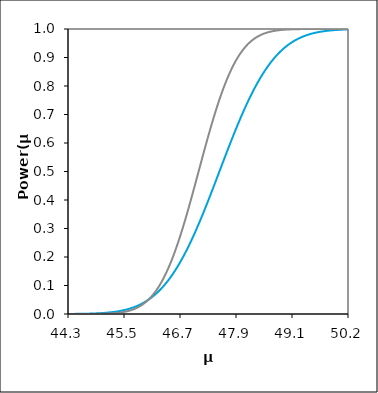
| Category | blue | red |
|---|---|---|
| 44.32138721247417 | 0 | 0 |
| 44.33322166362427 | 0 | 0 |
| 44.34505611477437 | 0 | 0 |
| 44.35689056592447 | 0 | 0 |
| 44.36872501707457 | 0 | 0 |
| 44.38055946822467 | 0 | 0 |
| 44.39239391937477 | 0 | 0 |
| 44.40422837052487 | 0 | 0 |
| 44.41606282167498 | 0 | 0 |
| 44.42789727282508 | 0 | 0 |
| 44.43973172397517 | 0 | 0 |
| 44.45156617512528 | 0 | 0 |
| 44.46340062627538 | 0 | 0 |
| 44.47523507742548 | 0 | 0 |
| 44.48706952857558 | 0 | 0 |
| 44.49890397972568 | 0.001 | 0 |
| 44.51073843087578 | 0.001 | 0 |
| 44.52257288202588 | 0.001 | 0 |
| 44.53440733317598 | 0.001 | 0 |
| 44.54624178432609 | 0.001 | 0 |
| 44.55807623547619 | 0.001 | 0 |
| 44.56991068662629 | 0.001 | 0 |
| 44.58174513777639 | 0.001 | 0 |
| 44.59357958892649 | 0.001 | 0 |
| 44.60541404007659 | 0.001 | 0 |
| 44.61724849122669 | 0.001 | 0 |
| 44.6290829423768 | 0.001 | 0 |
| 44.6409173935269 | 0.001 | 0 |
| 44.652751844677 | 0.001 | 0 |
| 44.6645862958271 | 0.001 | 0 |
| 44.6764207469772 | 0.001 | 0 |
| 44.6882551981273 | 0.001 | 0 |
| 44.70008964927739 | 0.001 | 0 |
| 44.7119241004275 | 0.001 | 0 |
| 44.7237585515776 | 0.001 | 0 |
| 44.7355930027277 | 0.001 | 0 |
| 44.7474274538778 | 0.001 | 0 |
| 44.7592619050279 | 0.001 | 0 |
| 44.771096356178 | 0.001 | 0 |
| 44.7829308073281 | 0.001 | 0 |
| 44.7947652584782 | 0.002 | 0 |
| 44.8065997096283 | 0.002 | 0 |
| 44.8184341607784 | 0.002 | 0 |
| 44.8302686119285 | 0.002 | 0 |
| 44.8421030630786 | 0.002 | 0 |
| 44.8539375142287 | 0.002 | 0 |
| 44.8657719653788 | 0.002 | 0 |
| 44.87760641652891 | 0.002 | 0 |
| 44.88944086767901 | 0.002 | 0 |
| 44.9012753188291 | 0.002 | 0 |
| 44.91310976997921 | 0.002 | 0 |
| 44.92494422112931 | 0.002 | 0 |
| 44.93677867227941 | 0.002 | 0.001 |
| 44.94861312342951 | 0.003 | 0.001 |
| 44.96044757457961 | 0.003 | 0.001 |
| 44.97228202572971 | 0.003 | 0.001 |
| 44.98411647687981 | 0.003 | 0.001 |
| 44.9959509280299 | 0.003 | 0.001 |
| 45.00778537918001 | 0.003 | 0.001 |
| 45.01961983033011 | 0.003 | 0.001 |
| 45.03145428148022 | 0.003 | 0.001 |
| 45.04328873263032 | 0.004 | 0.001 |
| 45.05512318378042 | 0.004 | 0.001 |
| 45.06695763493052 | 0.004 | 0.001 |
| 45.07879208608062 | 0.004 | 0.001 |
| 45.09062653723072 | 0.004 | 0.001 |
| 45.10246098838082 | 0.004 | 0.001 |
| 45.11429543953092 | 0.004 | 0.001 |
| 45.12612989068102 | 0.005 | 0.001 |
| 45.13796434183112 | 0.005 | 0.001 |
| 45.14979879298122 | 0.005 | 0.002 |
| 45.16163324413132 | 0.005 | 0.002 |
| 45.17346769528142 | 0.005 | 0.002 |
| 45.18530214643152 | 0.006 | 0.002 |
| 45.19713659758162 | 0.006 | 0.002 |
| 45.20897104873172 | 0.006 | 0.002 |
| 45.22080549988182 | 0.006 | 0.002 |
| 45.23263995103192 | 0.007 | 0.002 |
| 45.24447440218203 | 0.007 | 0.002 |
| 45.25630885333213 | 0.007 | 0.003 |
| 45.26814330448222 | 0.007 | 0.003 |
| 45.27997775563233 | 0.008 | 0.003 |
| 45.29181220678243 | 0.008 | 0.003 |
| 45.30364665793253 | 0.008 | 0.003 |
| 45.31548110908263 | 0.008 | 0.003 |
| 45.32731556023273 | 0.009 | 0.004 |
| 45.33915001138283 | 0.009 | 0.004 |
| 45.35098446253293 | 0.009 | 0.004 |
| 45.36281891368304 | 0.01 | 0.004 |
| 45.37465336483314 | 0.01 | 0.005 |
| 45.38648781598324 | 0.01 | 0.005 |
| 45.39832226713334 | 0.011 | 0.005 |
| 45.41015671828344 | 0.011 | 0.005 |
| 45.42199116943354 | 0.011 | 0.006 |
| 45.43382562058364 | 0.012 | 0.006 |
| 45.44566007173374 | 0.012 | 0.006 |
| 45.45749452288384 | 0.013 | 0.007 |
| 45.46932897403394 | 0.013 | 0.007 |
| 45.48116342518404 | 0.013 | 0.007 |
| 45.49299787633414 | 0.014 | 0.008 |
| 45.50483232748424 | 0.014 | 0.008 |
| 45.51666677863435 | 0.015 | 0.008 |
| 45.52850122978444 | 0.015 | 0.009 |
| 45.54033568093454 | 0.016 | 0.009 |
| 45.55217013208464 | 0.016 | 0.01 |
| 45.56400458323475 | 0.017 | 0.01 |
| 45.57583903438484 | 0.018 | 0.011 |
| 45.58767348553495 | 0.018 | 0.011 |
| 45.59950793668505 | 0.019 | 0.012 |
| 45.61134238783515 | 0.019 | 0.012 |
| 45.62317683898525 | 0.02 | 0.013 |
| 45.63501129013535 | 0.021 | 0.014 |
| 45.64684574128545 | 0.021 | 0.014 |
| 45.65868019243555 | 0.022 | 0.015 |
| 45.67051464358565 | 0.023 | 0.016 |
| 45.68234909473575 | 0.023 | 0.016 |
| 45.69418354588585 | 0.024 | 0.017 |
| 45.70601799703595 | 0.025 | 0.018 |
| 45.71785244818606 | 0.025 | 0.019 |
| 45.72968689933616 | 0.026 | 0.02 |
| 45.74152135048626 | 0.027 | 0.021 |
| 45.75335580163636 | 0.028 | 0.021 |
| 45.76519025278646 | 0.029 | 0.022 |
| 45.77702470393656 | 0.03 | 0.023 |
| 45.78885915508666 | 0.03 | 0.024 |
| 45.80069360623676 | 0.031 | 0.026 |
| 45.81252805738686 | 0.032 | 0.027 |
| 45.82436250853696 | 0.033 | 0.028 |
| 45.83619695968707 | 0.034 | 0.029 |
| 45.84803141083717 | 0.035 | 0.03 |
| 45.85986586198727 | 0.036 | 0.031 |
| 45.87170031313737 | 0.037 | 0.033 |
| 45.88353476428747 | 0.038 | 0.034 |
| 45.89536921543757 | 0.039 | 0.036 |
| 45.90720366658767 | 0.041 | 0.037 |
| 45.91903811773777 | 0.042 | 0.039 |
| 45.93087256888787 | 0.043 | 0.04 |
| 45.94270702003797 | 0.044 | 0.042 |
| 45.95454147118807 | 0.045 | 0.043 |
| 45.96637592233817 | 0.046 | 0.045 |
| 45.97821037348827 | 0.048 | 0.047 |
| 45.99004482463837 | 0.049 | 0.049 |
| 46.00187927578848 | 0.05 | 0.051 |
| 46.01371372693857 | 0.052 | 0.053 |
| 46.02554817808867 | 0.053 | 0.055 |
| 46.03738262923878 | 0.055 | 0.057 |
| 46.04921708038888 | 0.056 | 0.059 |
| 46.06105153153898 | 0.057 | 0.061 |
| 46.07288598268908 | 0.059 | 0.063 |
| 46.08472043383918 | 0.061 | 0.065 |
| 46.09655488498928 | 0.062 | 0.068 |
| 46.10838933613938 | 0.064 | 0.07 |
| 46.12022378728948 | 0.065 | 0.073 |
| 46.13205823843958 | 0.067 | 0.075 |
| 46.14389268958968 | 0.069 | 0.078 |
| 46.15572714073978 | 0.07 | 0.081 |
| 46.16756159188989 | 0.072 | 0.083 |
| 46.17939604303998 | 0.074 | 0.086 |
| 46.19123049419009 | 0.076 | 0.089 |
| 46.20306494534019 | 0.078 | 0.092 |
| 46.21489939649029 | 0.08 | 0.095 |
| 46.22673384764039 | 0.082 | 0.098 |
| 46.23856829879049 | 0.084 | 0.102 |
| 46.2504027499406 | 0.086 | 0.105 |
| 46.2622372010907 | 0.088 | 0.108 |
| 46.27407165224079 | 0.09 | 0.112 |
| 46.2859061033909 | 0.092 | 0.115 |
| 46.297740554541 | 0.094 | 0.119 |
| 46.30957500569109 | 0.096 | 0.123 |
| 46.3214094568412 | 0.098 | 0.126 |
| 46.3332439079913 | 0.101 | 0.13 |
| 46.3450783591414 | 0.103 | 0.134 |
| 46.3569128102915 | 0.105 | 0.138 |
| 46.3687472614416 | 0.108 | 0.142 |
| 46.3805817125917 | 0.11 | 0.146 |
| 46.3924161637418 | 0.113 | 0.151 |
| 46.4042506148919 | 0.115 | 0.155 |
| 46.416085066042 | 0.118 | 0.159 |
| 46.4279195171921 | 0.12 | 0.164 |
| 46.4397539683422 | 0.123 | 0.168 |
| 46.4515884194923 | 0.125 | 0.173 |
| 46.4634228706424 | 0.128 | 0.178 |
| 46.4752573217925 | 0.131 | 0.182 |
| 46.48709177294261 | 0.134 | 0.187 |
| 46.4989262240927 | 0.136 | 0.192 |
| 46.51076067524281 | 0.139 | 0.197 |
| 46.5225951263929 | 0.142 | 0.203 |
| 46.53442957754301 | 0.145 | 0.208 |
| 46.54626402869311 | 0.148 | 0.213 |
| 46.55809847984321 | 0.151 | 0.218 |
| 46.5699329309933 | 0.154 | 0.224 |
| 46.58176738214341 | 0.157 | 0.229 |
| 46.59360183329351 | 0.16 | 0.235 |
| 46.60543628444361 | 0.164 | 0.241 |
| 46.61727073559371 | 0.167 | 0.246 |
| 46.62910518674381 | 0.17 | 0.252 |
| 46.64093963789391 | 0.173 | 0.258 |
| 46.65277408904402 | 0.177 | 0.264 |
| 46.66460854019412 | 0.18 | 0.27 |
| 46.67644299134422 | 0.183 | 0.276 |
| 46.68827744249432 | 0.187 | 0.282 |
| 46.70011189364442 | 0.19 | 0.289 |
| 46.71194634479452 | 0.194 | 0.295 |
| 46.72378079594462 | 0.198 | 0.301 |
| 46.73561524709472 | 0.201 | 0.308 |
| 46.74744969824482 | 0.205 | 0.314 |
| 46.75928414939492 | 0.209 | 0.321 |
| 46.77111860054502 | 0.212 | 0.327 |
| 46.78295305169512 | 0.216 | 0.334 |
| 46.79478750284522 | 0.22 | 0.341 |
| 46.80662195399533 | 0.224 | 0.347 |
| 46.81845640514543 | 0.228 | 0.354 |
| 46.83029085629553 | 0.232 | 0.361 |
| 46.84212530744563 | 0.236 | 0.368 |
| 46.85395975859573 | 0.24 | 0.375 |
| 46.86579420974583 | 0.244 | 0.382 |
| 46.87762866089593 | 0.248 | 0.389 |
| 46.88946311204603 | 0.252 | 0.396 |
| 46.90129756319613 | 0.256 | 0.403 |
| 46.91313201434623 | 0.26 | 0.41 |
| 46.92496646549633 | 0.264 | 0.417 |
| 46.93680091664643 | 0.269 | 0.424 |
| 46.94863536779653 | 0.273 | 0.432 |
| 46.96046981894663 | 0.277 | 0.439 |
| 46.97230427009674 | 0.282 | 0.446 |
| 46.98413872124684 | 0.286 | 0.453 |
| 46.99597317239694 | 0.29 | 0.46 |
| 47.00780762354704 | 0.295 | 0.468 |
| 47.01964207469714 | 0.299 | 0.475 |
| 47.03147652584724 | 0.304 | 0.482 |
| 47.04331097699734 | 0.308 | 0.49 |
| 47.05514542814744 | 0.313 | 0.497 |
| 47.06697987929754 | 0.318 | 0.504 |
| 47.07881433044764 | 0.322 | 0.512 |
| 47.09064878159774 | 0.327 | 0.519 |
| 47.10248323274784 | 0.332 | 0.526 |
| 47.11431768389794 | 0.336 | 0.534 |
| 47.12615213504804 | 0.341 | 0.541 |
| 47.13798658619815 | 0.346 | 0.548 |
| 47.14982103734825 | 0.351 | 0.555 |
| 47.16165548849835 | 0.355 | 0.563 |
| 47.17348993964845 | 0.36 | 0.57 |
| 47.18532439079855 | 0.365 | 0.577 |
| 47.19715884194864 | 0.37 | 0.584 |
| 47.20899329309875 | 0.375 | 0.591 |
| 47.22082774424885 | 0.38 | 0.598 |
| 47.23266219539895 | 0.385 | 0.605 |
| 47.24449664654905 | 0.39 | 0.612 |
| 47.25633109769915 | 0.395 | 0.619 |
| 47.26816554884925 | 0.4 | 0.626 |
| 47.27999999999935 | 0.405 | 0.633 |
| 47.29183445114946 | 0.41 | 0.64 |
| 47.30366890229956 | 0.415 | 0.647 |
| 47.31550335344966 | 0.42 | 0.654 |
| 47.32733780459975 | 0.425 | 0.661 |
| 47.33917225574986 | 0.43 | 0.667 |
| 47.35100670689996 | 0.435 | 0.674 |
| 47.36284115805006 | 0.44 | 0.681 |
| 47.37467560920016 | 0.445 | 0.687 |
| 47.38651006035026 | 0.451 | 0.694 |
| 47.39834451150036 | 0.456 | 0.7 |
| 47.41017896265046 | 0.461 | 0.706 |
| 47.42201341380056 | 0.466 | 0.713 |
| 47.43384786495066 | 0.471 | 0.719 |
| 47.44568231610076 | 0.476 | 0.725 |
| 47.45751676725087 | 0.481 | 0.731 |
| 47.46935121840096 | 0.487 | 0.737 |
| 47.48118566955107 | 0.492 | 0.743 |
| 47.49302012070117 | 0.497 | 0.749 |
| 47.50485457185127 | 0.502 | 0.755 |
| 47.51668902300137 | 0.507 | 0.76 |
| 47.52852347415147 | 0.512 | 0.766 |
| 47.54035792530157 | 0.518 | 0.772 |
| 47.55219237645167 | 0.523 | 0.777 |
| 47.56402682760177 | 0.528 | 0.783 |
| 47.57586127875187 | 0.533 | 0.788 |
| 47.58769572990197 | 0.538 | 0.793 |
| 47.59953018105207 | 0.543 | 0.798 |
| 47.61136463220217 | 0.549 | 0.803 |
| 47.62319908335228 | 0.554 | 0.809 |
| 47.63503353450237 | 0.559 | 0.813 |
| 47.64686798565248 | 0.564 | 0.818 |
| 47.65870243680258 | 0.569 | 0.823 |
| 47.67053688795268 | 0.574 | 0.828 |
| 47.68237133910277 | 0.579 | 0.833 |
| 47.69420579025288 | 0.584 | 0.837 |
| 47.70604024140298 | 0.589 | 0.842 |
| 47.71787469255308 | 0.594 | 0.846 |
| 47.72970914370318 | 0.599 | 0.85 |
| 47.74154359485328 | 0.604 | 0.854 |
| 47.75337804600338 | 0.609 | 0.859 |
| 47.76521249715348 | 0.614 | 0.863 |
| 47.77704694830359 | 0.619 | 0.867 |
| 47.78888139945369 | 0.624 | 0.871 |
| 47.80071585060379 | 0.629 | 0.874 |
| 47.81255030175389 | 0.634 | 0.878 |
| 47.82438475290399 | 0.639 | 0.882 |
| 47.83621920405409 | 0.644 | 0.885 |
| 47.84805365520419 | 0.648 | 0.889 |
| 47.85988810635429 | 0.653 | 0.892 |
| 47.87172255750439 | 0.658 | 0.896 |
| 47.88355700865449 | 0.663 | 0.899 |
| 47.89539145980459 | 0.668 | 0.902 |
| 47.9072259109547 | 0.672 | 0.905 |
| 47.9190603621048 | 0.677 | 0.908 |
| 47.93089481325489 | 0.682 | 0.911 |
| 47.942729264405 | 0.686 | 0.914 |
| 47.9545637155551 | 0.691 | 0.917 |
| 47.9663981667052 | 0.695 | 0.92 |
| 47.9782326178553 | 0.7 | 0.923 |
| 47.9900670690054 | 0.704 | 0.925 |
| 48.0019015201555 | 0.709 | 0.928 |
| 48.0137359713056 | 0.713 | 0.93 |
| 48.0255704224557 | 0.718 | 0.933 |
| 48.0374048736058 | 0.722 | 0.935 |
| 48.0492393247559 | 0.726 | 0.937 |
| 48.061073775906 | 0.731 | 0.94 |
| 48.0729082270561 | 0.735 | 0.942 |
| 48.0847426782062 | 0.739 | 0.944 |
| 48.09657712935631 | 0.743 | 0.946 |
| 48.10841158050641 | 0.747 | 0.948 |
| 48.12024603165651 | 0.752 | 0.95 |
| 48.13208048280661 | 0.756 | 0.952 |
| 48.1439149339567 | 0.76 | 0.953 |
| 48.15574938510681 | 0.764 | 0.955 |
| 48.16758383625691 | 0.768 | 0.957 |
| 48.17941828740701 | 0.772 | 0.959 |
| 48.1912527385571 | 0.776 | 0.96 |
| 48.20308718970721 | 0.779 | 0.962 |
| 48.21492164085731 | 0.783 | 0.963 |
| 48.22675609200741 | 0.787 | 0.965 |
| 48.23859054315751 | 0.791 | 0.966 |
| 48.25042499430761 | 0.794 | 0.967 |
| 48.26225944545771 | 0.798 | 0.969 |
| 48.27409389660782 | 0.802 | 0.97 |
| 48.28592834775791 | 0.805 | 0.971 |
| 48.29776279890801 | 0.809 | 0.972 |
| 48.30959725005812 | 0.812 | 0.974 |
| 48.32143170120822 | 0.816 | 0.975 |
| 48.33326615235832 | 0.819 | 0.976 |
| 48.34510060350842 | 0.823 | 0.977 |
| 48.35693505465852 | 0.826 | 0.978 |
| 48.36876950580862 | 0.829 | 0.979 |
| 48.38060395695872 | 0.833 | 0.98 |
| 48.39243840810882 | 0.836 | 0.981 |
| 48.40427285925892 | 0.839 | 0.981 |
| 48.41610731040902 | 0.842 | 0.982 |
| 48.42794176155913 | 0.845 | 0.983 |
| 48.43977621270922 | 0.848 | 0.984 |
| 48.45161066385933 | 0.851 | 0.984 |
| 48.46344511500943 | 0.854 | 0.985 |
| 48.47527956615953 | 0.857 | 0.986 |
| 48.48711401730963 | 0.86 | 0.986 |
| 48.49894846845973 | 0.863 | 0.987 |
| 48.51078291960983 | 0.866 | 0.988 |
| 48.52261737075993 | 0.869 | 0.988 |
| 48.53445182191003 | 0.871 | 0.989 |
| 48.54628627306013 | 0.874 | 0.989 |
| 48.55812072421023 | 0.877 | 0.99 |
| 48.56995517536033 | 0.879 | 0.99 |
| 48.58178962651044 | 0.882 | 0.991 |
| 48.59362407766054 | 0.885 | 0.991 |
| 48.60545852881064 | 0.887 | 0.992 |
| 48.61729297996074 | 0.89 | 0.992 |
| 48.62912743111084 | 0.892 | 0.992 |
| 48.64096188226094 | 0.894 | 0.993 |
| 48.65279633341104 | 0.897 | 0.993 |
| 48.66463078456114 | 0.899 | 0.994 |
| 48.67646523571124 | 0.901 | 0.994 |
| 48.68829968686134 | 0.903 | 0.994 |
| 48.70013413801144 | 0.906 | 0.994 |
| 48.71196858916154 | 0.908 | 0.995 |
| 48.72380304031164 | 0.91 | 0.995 |
| 48.73563749146174 | 0.912 | 0.995 |
| 48.74747194261184 | 0.914 | 0.996 |
| 48.75930639376194 | 0.916 | 0.996 |
| 48.77114084491204 | 0.918 | 0.996 |
| 48.78297529606214 | 0.92 | 0.996 |
| 48.79480974721225 | 0.922 | 0.996 |
| 48.80664419836235 | 0.924 | 0.997 |
| 48.81847864951245 | 0.926 | 0.997 |
| 48.83031310066255 | 0.927 | 0.997 |
| 48.84214755181265 | 0.929 | 0.997 |
| 48.85398200296275 | 0.931 | 0.997 |
| 48.86581645411285 | 0.933 | 0.997 |
| 48.87765090526295 | 0.934 | 0.998 |
| 48.88948535641305 | 0.936 | 0.998 |
| 48.90131980756315 | 0.938 | 0.998 |
| 48.91315425871326 | 0.939 | 0.998 |
| 48.92498870986336 | 0.941 | 0.998 |
| 48.93682316101346 | 0.942 | 0.998 |
| 48.94865761216356 | 0.944 | 0.998 |
| 48.96049206331366 | 0.945 | 0.998 |
| 48.97232651446376 | 0.947 | 0.998 |
| 48.98416096561386 | 0.948 | 0.999 |
| 48.99599541676396 | 0.949 | 0.999 |
| 49.00782986791406 | 0.951 | 0.999 |
| 49.01966431906416 | 0.952 | 0.999 |
| 49.03149877021426 | 0.953 | 0.999 |
| 49.04333322136436 | 0.955 | 0.999 |
| 49.05516767251446 | 0.956 | 0.999 |
| 49.06700212366457 | 0.957 | 0.999 |
| 49.07883657481467 | 0.958 | 0.999 |
| 49.09067102596477 | 0.959 | 0.999 |
| 49.10250547711487 | 0.96 | 0.999 |
| 49.11433992826497 | 0.962 | 0.999 |
| 49.12617437941507 | 0.963 | 0.999 |
| 49.13800883056516 | 0.964 | 0.999 |
| 49.14984328171527 | 0.965 | 0.999 |
| 49.16167773286537 | 0.966 | 0.999 |
| 49.17351218401547 | 0.967 | 0.999 |
| 49.18534663516557 | 0.968 | 1 |
| 49.19718108631567 | 0.968 | 1 |
| 49.20901553746577 | 0.969 | 1 |
| 49.22084998861587 | 0.97 | 1 |
| 49.23268443976598 | 0.971 | 1 |
| 49.24451889091607 | 0.972 | 1 |
| 49.25635334206617 | 0.973 | 1 |
| 49.26818779321628 | 0.974 | 1 |
| 49.28002224436638 | 0.974 | 1 |
| 49.29185669551648 | 0.975 | 1 |
| 49.30369114666658 | 0.976 | 1 |
| 49.31552559781668 | 0.977 | 1 |
| 49.32736004896678 | 0.977 | 1 |
| 49.33919450011688 | 0.978 | 1 |
| 49.35102895126698 | 0.979 | 1 |
| 49.36286340241708 | 0.979 | 1 |
| 49.37469785356718 | 0.98 | 1 |
| 49.38653230471728 | 0.981 | 1 |
| 49.39836675586739 | 0.981 | 1 |
| 49.41020120701749 | 0.982 | 1 |
| 49.42203565816759 | 0.982 | 1 |
| 49.43387010931769 | 0.983 | 1 |
| 49.44570456046779 | 0.983 | 1 |
| 49.45753901161789 | 0.984 | 1 |
| 49.469373462768 | 0.985 | 1 |
| 49.48120791391809 | 0.985 | 1 |
| 49.4930423650682 | 0.985 | 1 |
| 49.50487681621829 | 0.986 | 1 |
| 49.51671126736839 | 0.986 | 1 |
| 49.5285457185185 | 0.987 | 1 |
| 49.54038016966859 | 0.987 | 1 |
| 49.5522146208187 | 0.988 | 1 |
| 49.5640490719688 | 0.988 | 1 |
| 49.5758835231189 | 0.989 | 1 |
| 49.587717974269 | 0.989 | 1 |
| 49.5995524254191 | 0.989 | 1 |
| 49.6113868765692 | 0.99 | 1 |
| 49.6232213277193 | 0.99 | 1 |
| 49.6350557788694 | 0.99 | 1 |
| 49.6468902300195 | 0.991 | 1 |
| 49.6587246811696 | 0.991 | 1 |
| 49.6705591323197 | 0.991 | 1 |
| 49.6823935834698 | 0.992 | 1 |
| 49.6942280346199 | 0.992 | 1 |
| 49.70606248577 | 0.992 | 1 |
| 49.7178969369201 | 0.992 | 1 |
| 49.7297313880702 | 0.993 | 1 |
| 49.74156583922031 | 0.993 | 1 |
| 49.75340029037041 | 0.993 | 1 |
| 49.7652347415205 | 0.993 | 1 |
| 49.77706919267061 | 0.994 | 1 |
| 49.7889036438207 | 0.994 | 1 |
| 49.8007380949708 | 0.994 | 1 |
| 49.8125725461209 | 0.994 | 1 |
| 49.82440699727101 | 0.995 | 1 |
| 49.83624144842111 | 0.995 | 1 |
| 49.84807589957121 | 0.995 | 1 |
| 49.85991035072131 | 0.995 | 1 |
| 49.87174480187142 | 0.995 | 1 |
| 49.88357925302152 | 0.995 | 1 |
| 49.89541370417161 | 0.996 | 1 |
| 49.90724815532172 | 0.996 | 1 |
| 49.91908260647182 | 0.996 | 1 |
| 49.93091705762192 | 0.996 | 1 |
| 49.94275150877202 | 0.996 | 1 |
| 49.95458595992212 | 0.996 | 1 |
| 49.96642041107222 | 0.997 | 1 |
| 49.97825486222232 | 0.997 | 1 |
| 49.99008931337242 | 0.997 | 1 |
| 50.00192376452252 | 0.997 | 1 |
| 50.01375821567262 | 0.997 | 1 |
| 50.02559266682272 | 0.997 | 1 |
| 50.03742711797283 | 0.997 | 1 |
| 50.04926156912293 | 0.997 | 1 |
| 50.06109602027303 | 0.997 | 1 |
| 50.07293047142313 | 0.998 | 1 |
| 50.08476492257323 | 0.998 | 1 |
| 50.09659937372333 | 0.998 | 1 |
| 50.10843382487342 | 0.998 | 1 |
| 50.12026827602353 | 0.998 | 1 |
| 50.13210272717363 | 0.998 | 1 |
| 50.14393717832373 | 0.998 | 1 |
| 50.15577162947383 | 0.998 | 1 |
| 50.16760608062393 | 0.998 | 1 |
| 50.17944053177403 | 0.998 | 1 |
| 50.19127498292413 | 0.998 | 1 |
| 50.20310943407423 | 0.998 | 1 |
| 50.21494388522434 | 0.999 | 1 |
| 50.22677833637443 | 0.999 | 1 |
| 50.23861278752453 | 0.999 | 1 |